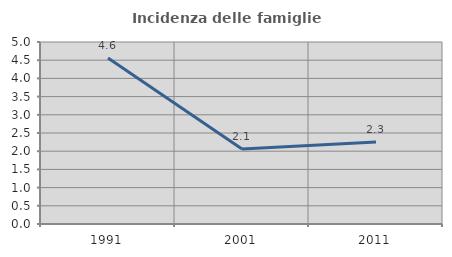
| Category | Incidenza delle famiglie numerose |
|---|---|
| 1991.0 | 4.558 |
| 2001.0 | 2.059 |
| 2011.0 | 2.256 |